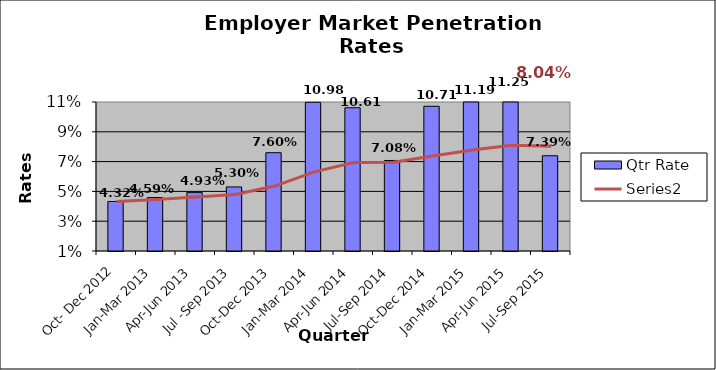
| Category | Qtr Rate |
|---|---|
| Oct- Dec 2012 | 0.043 |
| Jan-Mar 2013 | 0.046 |
| Apr-Jun 2013 | 0.049 |
| Jul -Sep 2013 | 0.053 |
| Oct-Dec 2013 | 0.076 |
| Jan-Mar 2014 | 0.11 |
| Apr-Jun 2014 | 0.106 |
| Jul-Sep 2014 | 0.071 |
| Oct-Dec 2014 | 0.107 |
| Jan-Mar 2015 | 0.112 |
| Apr-Jun 2015 | 0.112 |
| Jul-Sep 2015 | 0.074 |